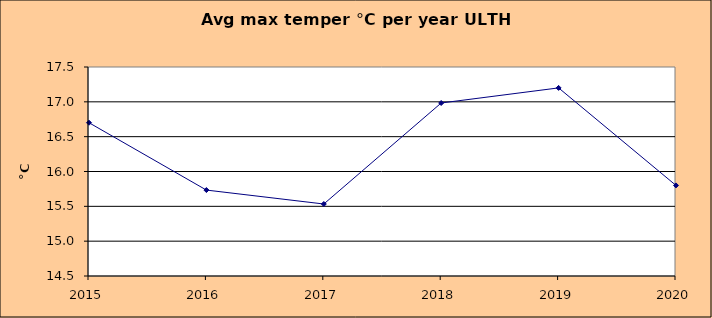
| Category | Series 0 |
|---|---|
| 2015.0 | 16.7 |
| 2016.0 | 15.733 |
| 2017.0 | 15.533 |
| 2018.0 | 16.983 |
| 2019.0 | 17.2 |
| 2020.0 | 15.8 |